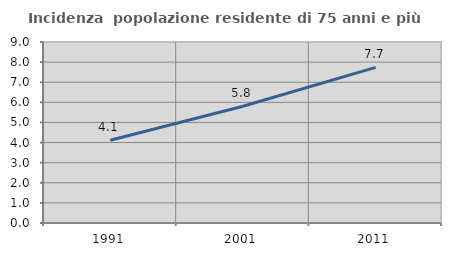
| Category | Incidenza  popolazione residente di 75 anni e più |
|---|---|
| 1991.0 | 4.113 |
| 2001.0 | 5.807 |
| 2011.0 | 7.741 |